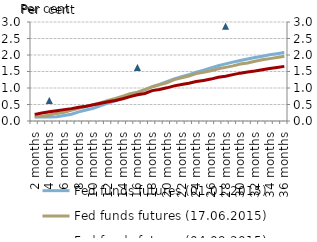
| Category | Fed funds futures (01.01.2015) | Fed funds futures (17.06.2015) | Fed funds futures (04.09.2015) |
|---|---|---|---|
| 2 months | 0.115 | 0.135 | 0.2 |
| 3 months | 0.125 | 0.14 | 0.245 |
| 4 months | 0.125 | 0.18 | 0.28 |
| 5 months | 0.13 | 0.23 | 0.31 |
| 6 months | 0.165 | 0.265 | 0.345 |
| 7 months | 0.205 | 0.325 | 0.375 |
| 8 months | 0.275 | 0.385 | 0.415 |
| 9 months | 0.335 | 0.435 | 0.45 |
| 10 months | 0.385 | 0.495 | 0.495 |
| 11 months | 0.47 | 0.555 | 0.54 |
| 12 months | 0.545 | 0.62 | 0.585 |
| 13 months | 0.61 | 0.685 | 0.62 |
| 14 months | 0.705 | 0.755 | 0.675 |
| 15 months | 0.79 | 0.83 | 0.74 |
| 16 months | 0.86 | 0.875 | 0.795 |
| 17 months | 0.94 | 0.95 | 0.835 |
| 18 months | 1.04 | 1.035 | 0.92 |
| 19 months | 1.11 | 1.1 | 0.955 |
| 20 months | 1.195 | 1.155 | 1.005 |
| 21 months | 1.275 | 1.255 | 1.065 |
| 22 months | 1.34 | 1.31 | 1.105 |
| 23 months | 1.405 | 1.365 | 1.145 |
| 24 months | 1.48 | 1.435 | 1.195 |
| 25 months | 1.54 | 1.48 | 1.23 |
| 26 months | 1.61 | 1.525 | 1.27 |
| 27 months | 1.675 | 1.585 | 1.325 |
| 28 months | 1.73 | 1.625 | 1.355 |
| 29 months | 1.785 | 1.67 | 1.405 |
| 30 months | 1.835 | 1.725 | 1.45 |
| 31 months | 1.88 | 1.76 | 1.485 |
| 32 months | 1.925 | 1.81 | 1.515 |
| 33 months | 1.965 | 1.855 | 1.555 |
| 34 months | 2.005 | 1.89 | 1.59 |
| 35 months | 2.04 | 1.925 | 1.62 |
| 36 months | 2.075 | 1.965 | 1.655 |